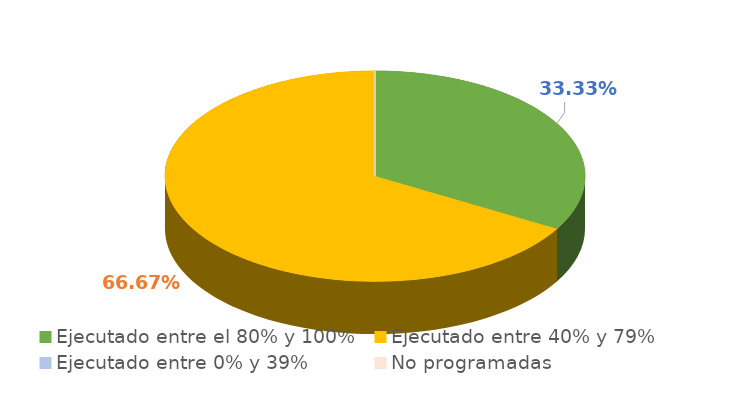
| Category | Series 0 |
|---|---|
| Ejecutado entre el 80% y 100% | 0.333 |
| Ejecutado entre 40% y 79% | 0.667 |
| Ejecutado entre 0% y 39% | 0 |
| No programadas | 0 |